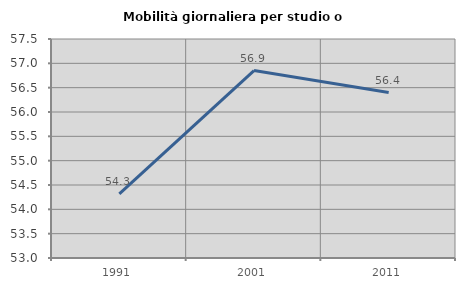
| Category | Mobilità giornaliera per studio o lavoro |
|---|---|
| 1991.0 | 54.319 |
| 2001.0 | 56.851 |
| 2011.0 | 56.399 |